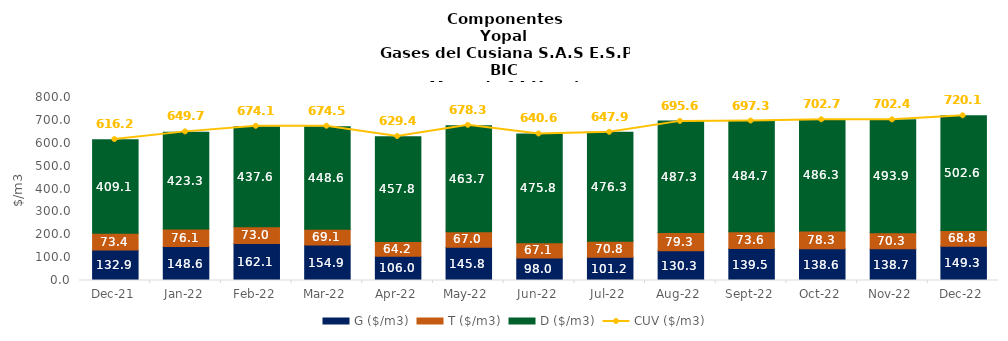
| Category | G ($/m3) | T ($/m3) | D ($/m3) |
|---|---|---|---|
| 2021-12-01 | 132.89 | 73.37 | 409.12 |
| 2022-01-01 | 148.58 | 76.09 | 423.28 |
| 2022-02-01 | 162.07 | 73 | 437.58 |
| 2022-03-01 | 154.9 | 69.08 | 448.55 |
| 2022-04-01 | 105.95 | 64.24 | 457.83 |
| 2022-05-01 | 145.79 | 66.96 | 463.72 |
| 2022-06-01 | 98.04 | 67.12 | 475.76 |
| 2022-07-01 | 101.2 | 70.76 | 476.31 |
| 2022-08-01 | 130.34 | 79.28 | 487.29 |
| 2022-09-01 | 139.5 | 73.63 | 484.74 |
| 2022-10-01 | 138.55 | 78.32 | 486.3 |
| 2022-11-01 | 138.65 | 70.31 | 493.89 |
| 2022-12-01 | 149.33 | 68.76 | 502.55 |